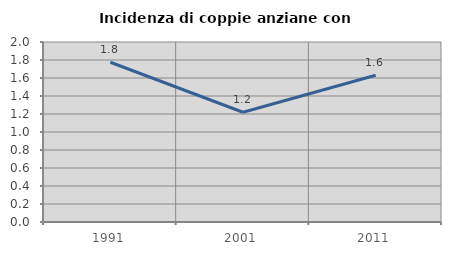
| Category | Incidenza di coppie anziane con figli |
|---|---|
| 1991.0 | 1.775 |
| 2001.0 | 1.22 |
| 2011.0 | 1.63 |